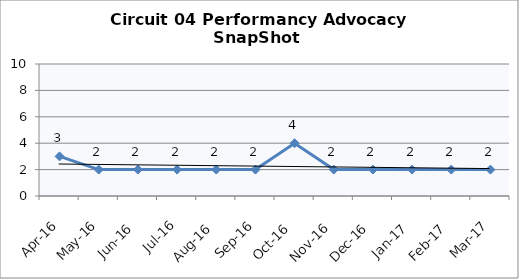
| Category | Circuit 04 |
|---|---|
| Apr-16 | 3 |
| May-16 | 2 |
| Jun-16 | 2 |
| Jul-16 | 2 |
| Aug-16 | 2 |
| Sep-16 | 2 |
| Oct-16 | 4 |
| Nov-16 | 2 |
| Dec-16 | 2 |
| Jan-17 | 2 |
| Feb-17 | 2 |
| Mar-17 | 2 |